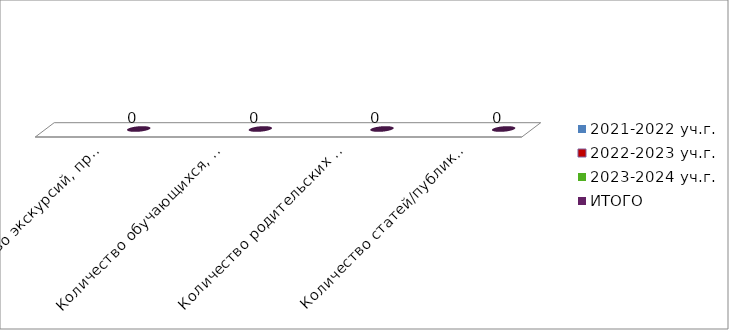
| Category | 2021-2022 уч.г. | 2022-2023 уч.г. | 2023-2024 уч.г. | ИТОГО |
|---|---|---|---|---|
| Количество экскурсий, проведённых с целью профессиональной ориентации школьников |  |  |  | 0 |
| Количество обучающихся, принявших участие в экскурсиях (суммарно) |  |  |  | 0 |
| Количество родительских собраний по темам будущего профессионального выбора школьников |  |  |  | 0 |
| Количество статей/публикаций по теме развития навыков профессионального ориентирования, созданных обучающимися  школы |  |  |  | 0 |